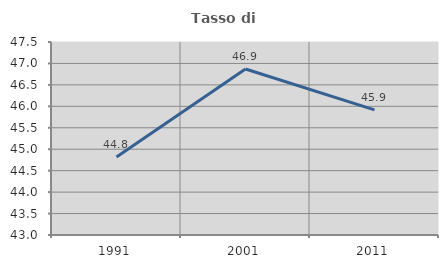
| Category | Tasso di occupazione   |
|---|---|
| 1991.0 | 44.82 |
| 2001.0 | 46.872 |
| 2011.0 | 45.916 |